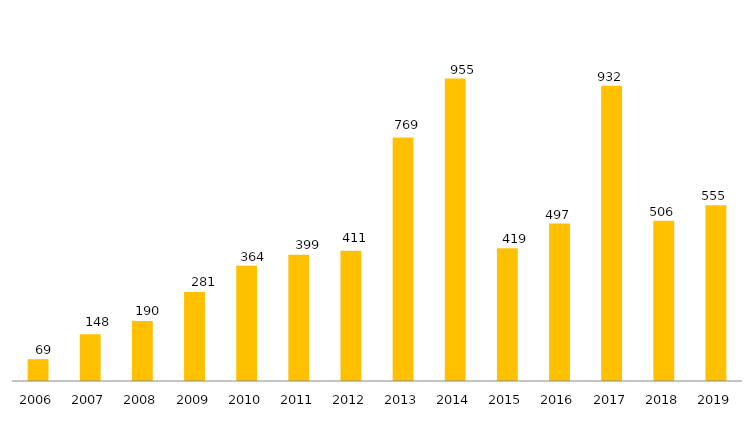
| Category | Pós - Graduação UFGD |
|---|---|
| 2006.0 | 69 |
| 2007.0 | 148 |
| 2008.0 | 190 |
| 2009.0 | 281 |
| 2010.0 | 364 |
| 2011.0 | 399 |
| 2012.0 | 411 |
| 2013.0 | 769 |
| 2014.0 | 955 |
| 2015.0 | 419 |
| 2016.0 | 497 |
| 2017.0 | 932 |
| 2018.0 | 506 |
| 2019.0 | 555 |